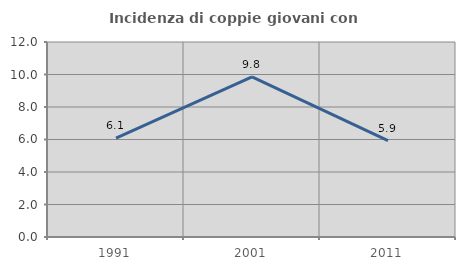
| Category | Incidenza di coppie giovani con figli |
|---|---|
| 1991.0 | 6.087 |
| 2001.0 | 9.848 |
| 2011.0 | 5.926 |